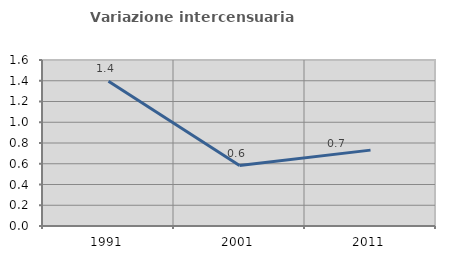
| Category | Variazione intercensuaria annua |
|---|---|
| 1991.0 | 1.396 |
| 2001.0 | 0.583 |
| 2011.0 | 0.731 |